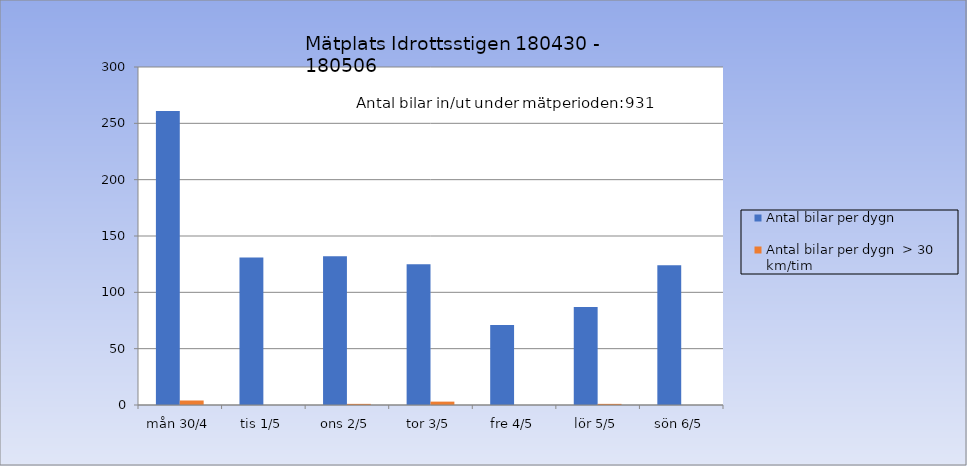
| Category | Antal bilar per dygn | Antal bilar per dygn  > 30 km/tim |
|---|---|---|
| mån 30/4 | 261 | 4 |
| tis 1/5 | 131 | 0 |
| ons 2/5 | 132 | 1 |
| tor 3/5 | 125 | 3 |
| fre 4/5 | 71 | 0 |
| lör 5/5 | 87 | 1 |
| sön 6/5 | 124 | 0 |